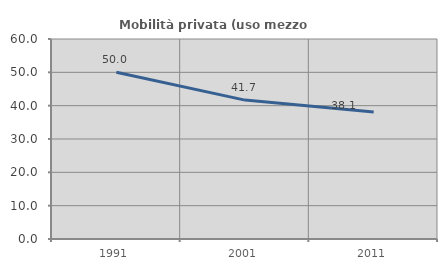
| Category | Mobilità privata (uso mezzo privato) |
|---|---|
| 1991.0 | 50 |
| 2001.0 | 41.667 |
| 2011.0 | 38.095 |